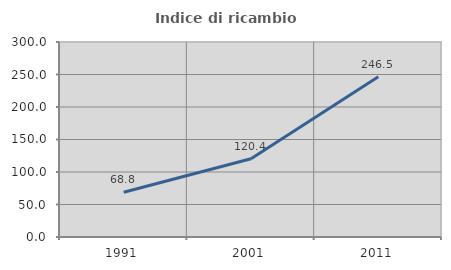
| Category | Indice di ricambio occupazionale  |
|---|---|
| 1991.0 | 68.828 |
| 2001.0 | 120.41 |
| 2011.0 | 246.535 |